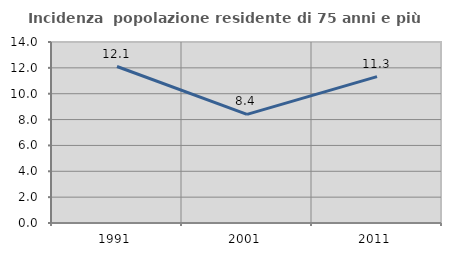
| Category | Incidenza  popolazione residente di 75 anni e più |
|---|---|
| 1991.0 | 12.104 |
| 2001.0 | 8.406 |
| 2011.0 | 11.321 |